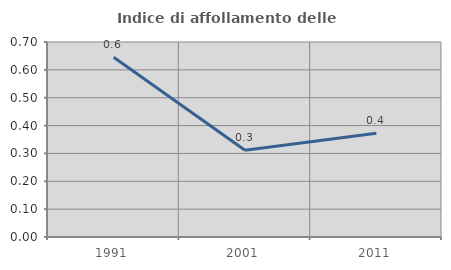
| Category | Indice di affollamento delle abitazioni  |
|---|---|
| 1991.0 | 0.645 |
| 2001.0 | 0.311 |
| 2011.0 | 0.373 |